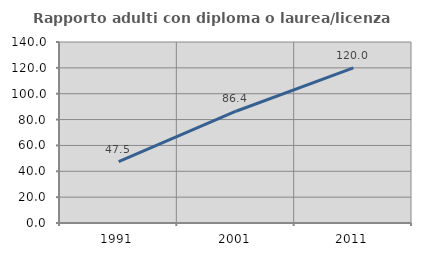
| Category | Rapporto adulti con diploma o laurea/licenza media  |
|---|---|
| 1991.0 | 47.534 |
| 2001.0 | 86.447 |
| 2011.0 | 120 |